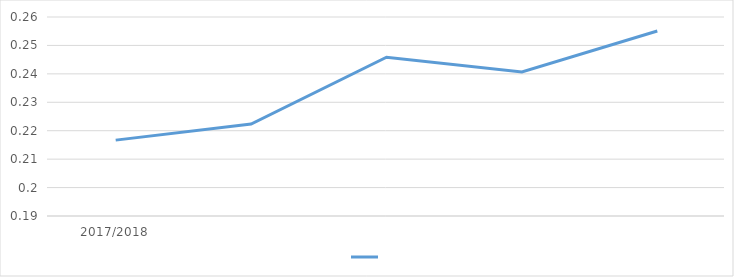
| Category | Series 0 |
|---|---|
| 2017/2018 | 0.217 |
|  | 0.222 |
|  | 0.246 |
|  | 0.241 |
|  | 0.255 |